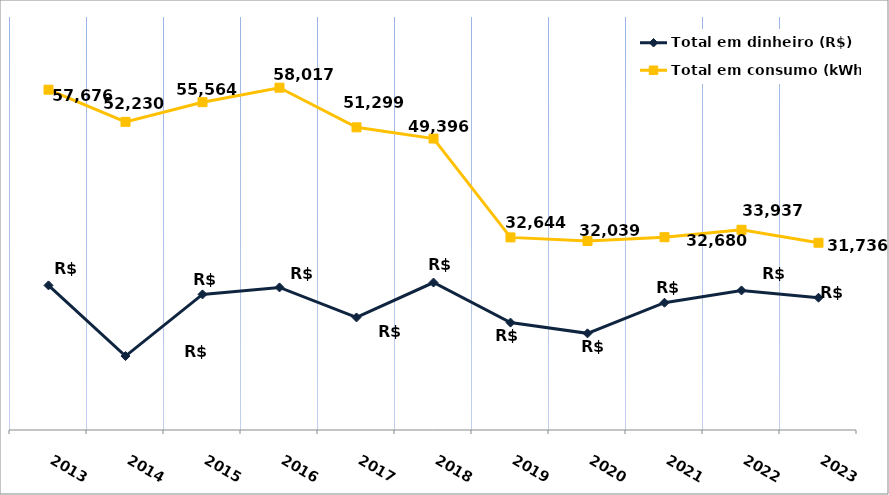
| Category | Total em dinheiro (R$) |
|---|---|
| 2013.0 | 24509.17 |
| 2014.0 | 12532.06 |
| 2015.0 | 22985.06 |
| 2016.0 | 24168.35 |
| 2017.0 | 19075.11 |
| 2018.0 | 24993.38 |
| 2019.0 | 18203.72 |
| 2020.0 | 16381.92 |
| 2021.0 | 21574.96 |
| 2022.0 | 23650.88 |
| 2023.0 | 22422.05 |